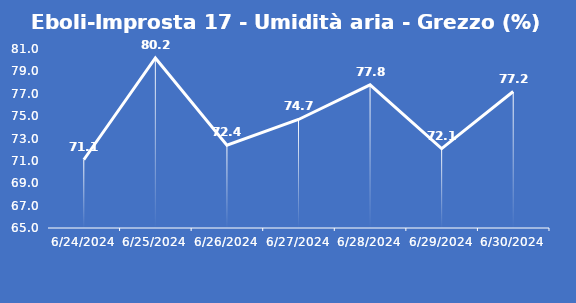
| Category | Eboli-Improsta 17 - Umidità aria - Grezzo (%) |
|---|---|
| 6/24/24 | 71.1 |
| 6/25/24 | 80.2 |
| 6/26/24 | 72.4 |
| 6/27/24 | 74.7 |
| 6/28/24 | 77.8 |
| 6/29/24 | 72.1 |
| 6/30/24 | 77.2 |